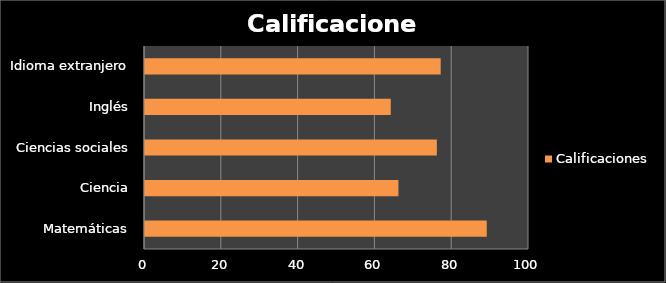
| Category | Calificaciones |
|---|---|
| Matemáticas | 89 |
| Ciencia | 66 |
| Ciencias sociales | 76 |
| Inglés | 64 |
| Idioma extranjero | 77 |